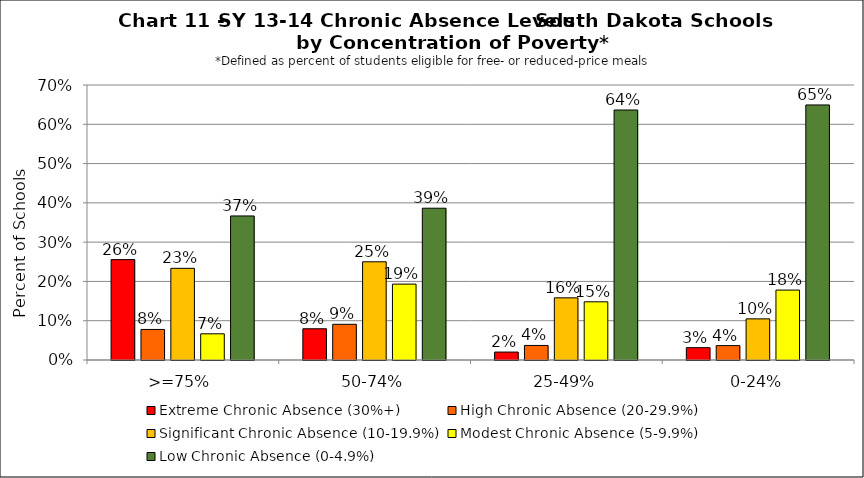
| Category | Extreme Chronic Absence (30%+) | High Chronic Absence (20-29.9%) | Significant Chronic Absence (10-19.9%) | Modest Chronic Absence (5-9.9%) | Low Chronic Absence (0-4.9%) |
|---|---|---|---|---|---|
| 0 | 0.256 | 0.078 | 0.233 | 0.067 | 0.367 |
| 1 | 0.08 | 0.091 | 0.25 | 0.193 | 0.386 |
| 2 | 0.02 | 0.037 | 0.158 | 0.148 | 0.636 |
| 3 | 0.031 | 0.037 | 0.105 | 0.178 | 0.649 |